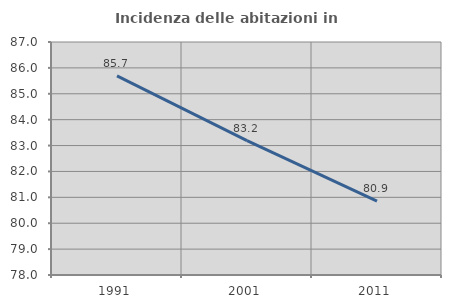
| Category | Incidenza delle abitazioni in proprietà  |
|---|---|
| 1991.0 | 85.689 |
| 2001.0 | 83.194 |
| 2011.0 | 80.853 |